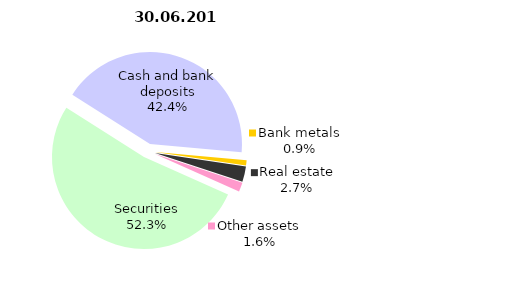
| Category | 30.06.2016 |
|---|---|
| Securities | 514221108.518 |
| Cash and bank deposits | 416474573.104 |
| Bank metals | 9215678.43 |
| Real estate | 26616041.65 |
| Other assets | 15781134.27 |